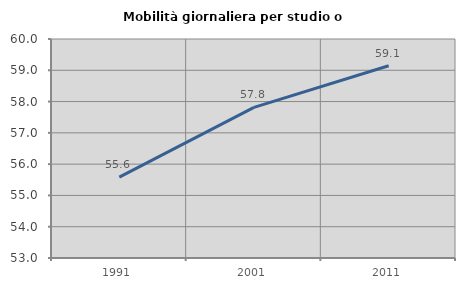
| Category | Mobilità giornaliera per studio o lavoro |
|---|---|
| 1991.0 | 55.584 |
| 2001.0 | 57.816 |
| 2011.0 | 59.144 |